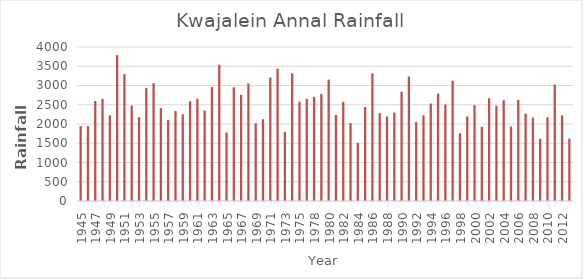
| Category | Series 1 |
|---|---|
| 1945.0 | 1946 |
| 1946.0 | 1943.5 |
| 1947.0 | 2597.1 |
| 1948.0 | 2652 |
| 1949.0 | 2226 |
| 1950.0 | 3788 |
| 1951.0 | 3296 |
| 1952.0 | 2480.4 |
| 1953.0 | 2177.8 |
| 1954.0 | 2939.8 |
| 1955.0 | 3060.5 |
| 1956.0 | 2413.4 |
| 1957.0 | 2106.7 |
| 1958.0 | 2339.1 |
| 1959.0 | 2253.8 |
| 1960.0 | 2591.8 |
| 1961.0 | 2654.6 |
| 1962.0 | 2351.7 |
| 1963.0 | 2963.4 |
| 1964.0 | 3540.6 |
| 1965.0 | 1780 |
| 1966.0 | 2953.2 |
| 1967.0 | 2759.3 |
| 1968.0 | 3055.2 |
| 1969.0 | 2017.4 |
| 1970.0 | 2124.1 |
| 1971.0 | 3209.2 |
| 1972.0 | 3440.4 |
| 1973.0 | 1793.9 |
| 1974.0 | 3317.6 |
| 1975.0 | 2580.8 |
| 1976.0 | 2654.3 |
| 1978.0 | 2706.4 |
| 1979.0 | 2777.6 |
| 1980.0 | 3154 |
| 1981.0 | 2234.7 |
| 1982.0 | 2570.9 |
| 1983.0 | 2027.3 |
| 1984.0 | 1508.3 |
| 1985.0 | 2441.7 |
| 1986.0 | 3313.9 |
| 1987.0 | 2281.7 |
| 1988.0 | 2196.6 |
| 1989.0 | 2296.5 |
| 1990.0 | 2839.6 |
| 1991.0 | 3234.1 |
| 1992.0 | 2048.9 |
| 1993.0 | 2226.7 |
| 1994.0 | 2531.6 |
| 1995.0 | 2790.7 |
| 1996.0 | 2506.8 |
| 1997.0 | 3124.7 |
| 1998.0 | 1756.5 |
| 1999.0 | 2194.9 |
| 2000.0 | 2490.6 |
| 2001.0 | 1927.5 |
| 2002.0 | 2668.7 |
| 2003.0 | 2474.2 |
| 2004.0 | 2616 |
| 2005.0 | 1936.6 |
| 2006.0 | 2627.4 |
| 2007.0 | 2268.3 |
| 2008.0 | 2167.5 |
| 2009.0 | 1617.8 |
| 2010.0 | 2175.4 |
| 2011.0 | 3024.2 |
| 2012.0 | 2223.7 |
| 2013.0 | 1621.8 |